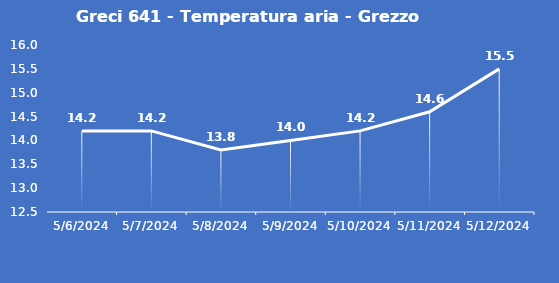
| Category | Greci 641 - Temperatura aria - Grezzo (°C) |
|---|---|
| 5/6/24 | 14.2 |
| 5/7/24 | 14.2 |
| 5/8/24 | 13.8 |
| 5/9/24 | 14 |
| 5/10/24 | 14.2 |
| 5/11/24 | 14.6 |
| 5/12/24 | 15.5 |